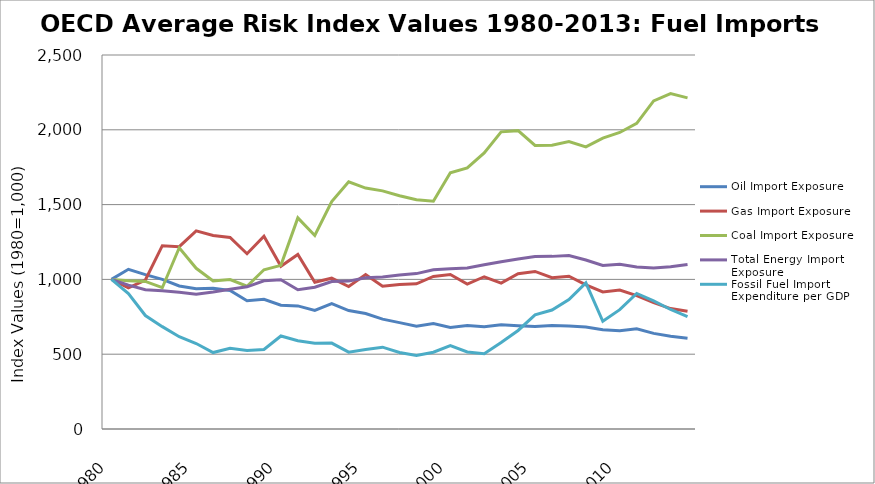
| Category | Oil Import Exposure | Gas Import Exposure | Coal Import Exposure | Total Energy Import Exposure | Fossil Fuel Import Expenditure per GDP |
|---|---|---|---|---|---|
| 1980.0 | 1000 | 1000 | 1000 | 1000 | 1000 |
| 1981.0 | 1067.541 | 944.03 | 990.945 | 962.028 | 905.292 |
| 1982.0 | 1031.814 | 995.891 | 986.52 | 930.44 | 758.589 |
| 1983.0 | 1000.133 | 1225.341 | 944.405 | 924.589 | 684.132 |
| 1984.0 | 955.87 | 1219.03 | 1211.529 | 914.572 | 616.578 |
| 1985.0 | 938.176 | 1324.584 | 1074.137 | 901.166 | 571.202 |
| 1986.0 | 941.383 | 1293.832 | 990.157 | 916.145 | 511.059 |
| 1987.0 | 925.54 | 1280.531 | 998.815 | 934.804 | 539.29 |
| 1988.0 | 857.839 | 1171.711 | 954.476 | 950.528 | 525.117 |
| 1989.0 | 866.688 | 1289.142 | 1064.459 | 990.544 | 531.404 |
| 1990.0 | 827.512 | 1087.318 | 1094.039 | 997.746 | 621.77 |
| 1991.0 | 822.694 | 1166.824 | 1411.205 | 931.168 | 590.235 |
| 1992.0 | 792.167 | 980.962 | 1293.319 | 947.937 | 573.028 |
| 1993.0 | 838.244 | 1008.052 | 1520.049 | 985.432 | 574.172 |
| 1994.0 | 791.968 | 952.434 | 1652.295 | 988.641 | 513.573 |
| 1995.0 | 772.29 | 1031.994 | 1610.697 | 1011.309 | 532.103 |
| 1996.0 | 734.37 | 953.996 | 1591.917 | 1015.312 | 547.038 |
| 1997.0 | 711.09 | 965.984 | 1559.1 | 1029.278 | 511.525 |
| 1998.0 | 686.636 | 970.301 | 1532.21 | 1038.769 | 491.194 |
| 1999.0 | 704.906 | 1020.024 | 1522.974 | 1064.488 | 513.182 |
| 2000.0 | 679.36 | 1033.25 | 1712.73 | 1071.246 | 557.43 |
| 2001.0 | 691.689 | 968.352 | 1745.735 | 1076.512 | 514.569 |
| 2002.0 | 684.24 | 1017.72 | 1845.964 | 1098.194 | 503.286 |
| 2003.0 | 696.626 | 975.343 | 1986.224 | 1118.203 | 578.168 |
| 2004.0 | 689.944 | 1038.013 | 1994.275 | 1135.905 | 658.697 |
| 2005.0 | 684.701 | 1053.109 | 1895.624 | 1152.731 | 763.382 |
| 2006.0 | 691.098 | 1011.555 | 1897.315 | 1153.924 | 795.295 |
| 2007.0 | 687.696 | 1021.476 | 1921.313 | 1159.914 | 865.985 |
| 2008.0 | 682.191 | 963.898 | 1886.29 | 1129.922 | 976.783 |
| 2009.0 | 663.758 | 915.785 | 1944.407 | 1093.257 | 720.129 |
| 2010.0 | 656.048 | 928.611 | 1982.167 | 1101.102 | 797.453 |
| 2011.0 | 669.318 | 891.641 | 2043.019 | 1083.478 | 906.378 |
| 2012.0 | 639.13 | 844.709 | 2193.355 | 1076.6 | 856.704 |
| 2013.0 | 619.545 | 805.146 | 2241.969 | 1083.927 | 799.019 |
| 2014.0 | 606.379 | 787.126 | 2213.58 | 1098.881 | 751.859 |